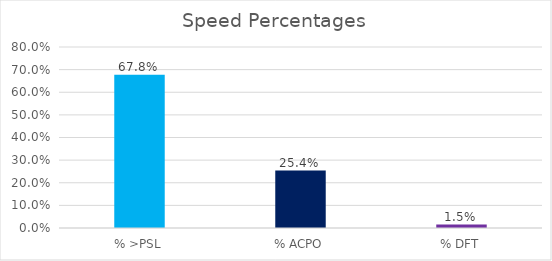
| Category | Series 0 |
|---|---|
| % >PSL | 0.678 |
| % ACPO | 0.254 |
| % DFT | 0.015 |